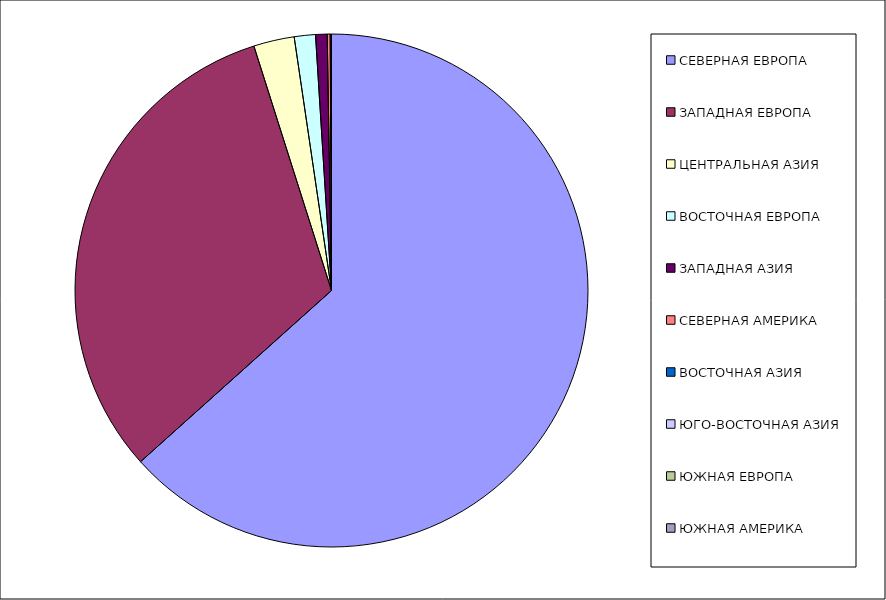
| Category | Оборот |
|---|---|
| СЕВЕРНАЯ ЕВРОПА | 63.366 |
| ЗАПАДНАЯ ЕВРОПА | 31.741 |
| ЦЕНТРАЛЬНАЯ АЗИЯ | 2.565 |
| ВОСТОЧНАЯ ЕВРОПА | 1.333 |
| ЗАПАДНАЯ АЗИЯ | 0.728 |
| СЕВЕРНАЯ АМЕРИКА | 0.185 |
| ВОСТОЧНАЯ АЗИЯ | 0.07 |
| ЮГО-ВОСТОЧНАЯ АЗИЯ | 0.008 |
| ЮЖНАЯ ЕВРОПА | 0.003 |
| ЮЖНАЯ АМЕРИКА | 0 |